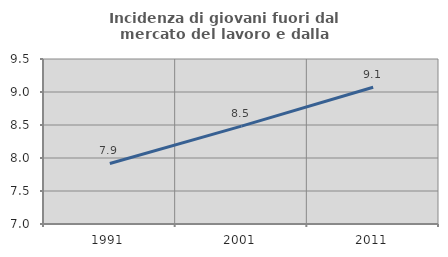
| Category | Incidenza di giovani fuori dal mercato del lavoro e dalla formazione  |
|---|---|
| 1991.0 | 7.917 |
| 2001.0 | 8.484 |
| 2011.0 | 9.071 |